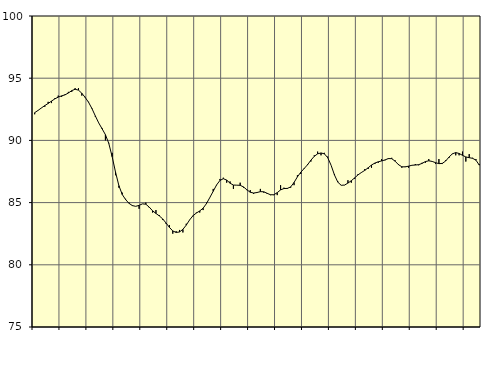
| Category | Piggar | Series 1 |
|---|---|---|
| nan | 92.1 | 92.23 |
| 87.0 | 92.4 | 92.41 |
| 87.0 | 92.6 | 92.61 |
| 87.0 | 92.7 | 92.8 |
| nan | 93.1 | 92.97 |
| 88.0 | 93 | 93.16 |
| 88.0 | 93.4 | 93.34 |
| 88.0 | 93.6 | 93.48 |
| nan | 93.5 | 93.58 |
| 89.0 | 93.7 | 93.66 |
| 89.0 | 93.9 | 93.81 |
| 89.0 | 93.9 | 94 |
| nan | 94.2 | 94.11 |
| 90.0 | 94.2 | 94.04 |
| 90.0 | 93.6 | 93.79 |
| 90.0 | 93.5 | 93.45 |
| nan | 93.1 | 93.06 |
| 91.0 | 92.6 | 92.56 |
| 91.0 | 91.9 | 91.97 |
| 91.0 | 91.4 | 91.41 |
| nan | 91 | 90.94 |
| 92.0 | 90 | 90.46 |
| 92.0 | 89.8 | 89.76 |
| 92.0 | 89 | 88.69 |
| nan | 87.2 | 87.45 |
| 93.0 | 86.2 | 86.36 |
| 93.0 | 85.8 | 85.65 |
| 93.0 | 85.3 | 85.24 |
| nan | 85 | 84.94 |
| 94.0 | 84.8 | 84.76 |
| 94.0 | 84.7 | 84.7 |
| 94.0 | 84.5 | 84.78 |
| nan | 84.9 | 84.9 |
| 95.0 | 85 | 84.87 |
| 95.0 | 84.6 | 84.64 |
| 95.0 | 84.2 | 84.34 |
| nan | 84.4 | 84.13 |
| 96.0 | 84 | 83.93 |
| 96.0 | 83.6 | 83.69 |
| 96.0 | 83.3 | 83.36 |
| nan | 83.2 | 83.01 |
| 97.0 | 82.5 | 82.72 |
| 97.0 | 82.7 | 82.6 |
| 97.0 | 82.8 | 82.64 |
| nan | 82.6 | 82.85 |
| 98.0 | 83.3 | 83.19 |
| 98.0 | 83.6 | 83.61 |
| 98.0 | 83.9 | 83.95 |
| nan | 84.2 | 84.16 |
| 99.0 | 84.2 | 84.33 |
| 99.0 | 84.4 | 84.55 |
| 99.0 | 85 | 84.92 |
| nan | 85.4 | 85.41 |
| 0.0 | 86.1 | 85.91 |
| 0.0 | 86.4 | 86.42 |
| 0.0 | 86.9 | 86.78 |
| nan | 87 | 86.92 |
| 1.0 | 86.6 | 86.81 |
| 1.0 | 86.7 | 86.56 |
| 1.0 | 86.1 | 86.41 |
| nan | 86.4 | 86.4 |
| 2.0 | 86.6 | 86.39 |
| 2.0 | 86.2 | 86.26 |
| 2.0 | 86 | 86.03 |
| nan | 86 | 85.83 |
| 3.0 | 85.7 | 85.77 |
| 3.0 | 85.8 | 85.81 |
| 3.0 | 86.1 | 85.88 |
| nan | 85.8 | 85.87 |
| 4.0 | 85.7 | 85.75 |
| 4.0 | 85.6 | 85.63 |
| 4.0 | 85.6 | 85.63 |
| nan | 85.6 | 85.8 |
| 5.0 | 86.4 | 86.02 |
| 5.0 | 86.2 | 86.13 |
| 5.0 | 86.1 | 86.14 |
| nan | 86.2 | 86.26 |
| 6.0 | 86.4 | 86.62 |
| 6.0 | 87.2 | 87.07 |
| 6.0 | 87.3 | 87.44 |
| nan | 87.7 | 87.74 |
| 7.0 | 88.1 | 88.04 |
| 7.0 | 88.3 | 88.41 |
| 7.0 | 88.8 | 88.72 |
| nan | 89.1 | 88.92 |
| 8.0 | 88.8 | 88.99 |
| 8.0 | 89 | 88.92 |
| 8.0 | 88.7 | 88.61 |
| nan | 88 | 88 |
| 9.0 | 87.3 | 87.22 |
| 9.0 | 86.7 | 86.64 |
| 9.0 | 86.4 | 86.39 |
| nan | 86.4 | 86.41 |
| 10.0 | 86.8 | 86.57 |
| 10.0 | 86.6 | 86.76 |
| 10.0 | 86.9 | 86.99 |
| nan | 87.3 | 87.23 |
| 11.0 | 87.4 | 87.42 |
| 11.0 | 87.7 | 87.59 |
| 11.0 | 87.7 | 87.8 |
| nan | 87.8 | 88.02 |
| 12.0 | 88.1 | 88.18 |
| 12.0 | 88.2 | 88.28 |
| 12.0 | 88.5 | 88.35 |
| nan | 88.4 | 88.43 |
| 13.0 | 88.5 | 88.54 |
| 13.0 | 88.6 | 88.53 |
| 13.0 | 88.4 | 88.33 |
| nan | 88.1 | 88.05 |
| 14.0 | 87.8 | 87.88 |
| 14.0 | 87.9 | 87.87 |
| 14.0 | 87.8 | 87.93 |
| nan | 88 | 88 |
| 15.0 | 88.1 | 88.02 |
| 15.0 | 88 | 88.05 |
| 15.0 | 88.2 | 88.15 |
| nan | 88.2 | 88.3 |
| 16.0 | 88.5 | 88.36 |
| 16.0 | 88.3 | 88.31 |
| 16.0 | 88.1 | 88.21 |
| nan | 88.5 | 88.13 |
| 17.0 | 88.1 | 88.15 |
| 17.0 | 88.4 | 88.34 |
| 17.0 | 88.6 | 88.66 |
| nan | 88.9 | 88.92 |
| 18.0 | 88.8 | 89.02 |
| 18.0 | 88.8 | 88.95 |
| 18.0 | 89.1 | 88.8 |
| nan | 88.3 | 88.67 |
| 19.0 | 88.9 | 88.61 |
| 19.0 | 88.6 | 88.56 |
| 19.0 | 88.5 | 88.41 |
| nan | 88.1 | 88.01 |